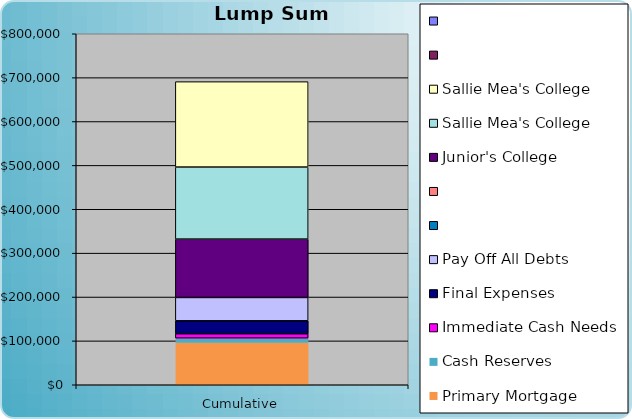
| Category | Primary Mortgage | Cash Reserves | Immediate Cash Needs | Final Expenses | Pay Off All Debts |   | Junior's College | Sallie Mea's College |
|---|---|---|---|---|---|---|---|---|
| 0 | 96247.428 | 10000 | 10000 | 29500 | 53228.929 | 0 | 133034.748 | 194634.575 |